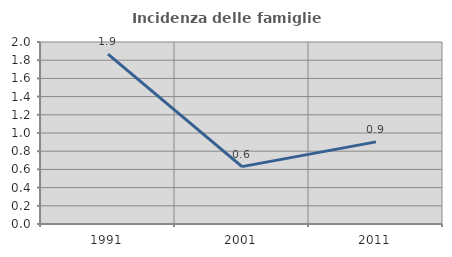
| Category | Incidenza delle famiglie numerose |
|---|---|
| 1991.0 | 1.868 |
| 2001.0 | 0.63 |
| 2011.0 | 0.902 |